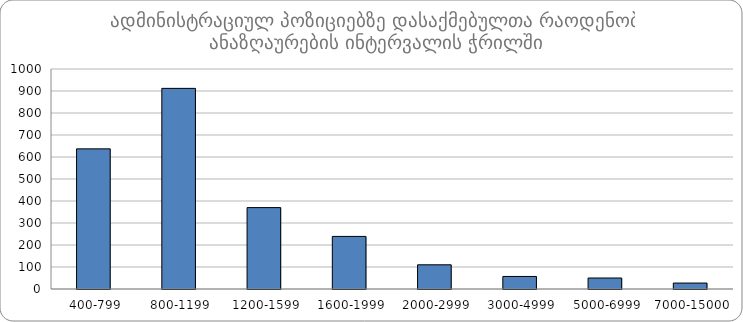
| Category | ჯამი |
|---|---|
|  400-799 | 637 |
|  800-1199 | 912 |
|  1200-1599 | 370 |
|  1600-1999 | 239 |
|  2000-2999 | 110 |
|  3000-4999 | 57 |
|  5000-6999 | 50 |
|  7000-15000 | 27 |